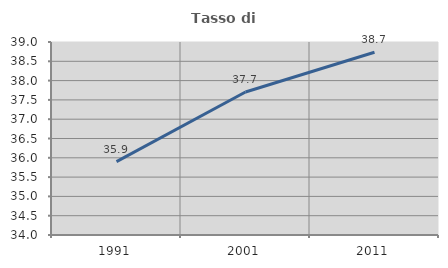
| Category | Tasso di occupazione   |
|---|---|
| 1991.0 | 35.9 |
| 2001.0 | 37.705 |
| 2011.0 | 38.735 |